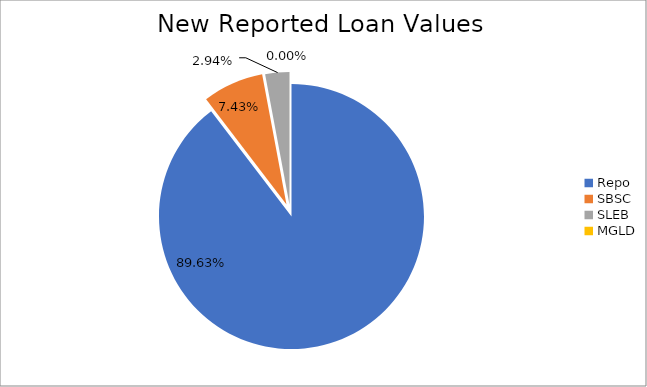
| Category | Series 0 |
|---|---|
| Repo | 12016401.849 |
| SBSC | 996036.079 |
| SLEB | 394590.319 |
| MGLD | 117.547 |